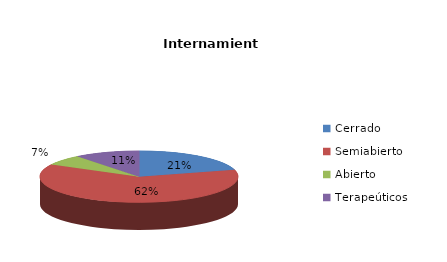
| Category | Series 0 |
|---|---|
| Cerrado | 150 |
| Semiabierto | 450 |
| Abierto | 48 |
| Terapeúticos | 77 |